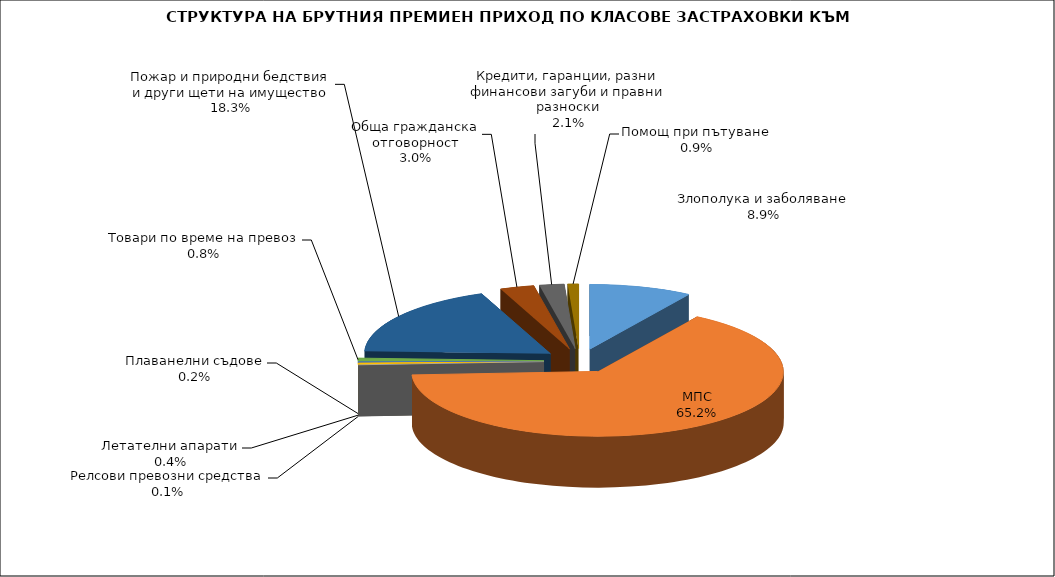
| Category | Злополука и заболяване |
|---|---|
| Злополука и заболяване | 0.089 |
| МПС | 0.652 |
| Релсови превозни средства | 0.001 |
| Летателни апарати | 0.004 |
| Плаванелни съдове | 0.002 |
| Товари по време на превоз | 0.008 |
| Пожар и природни бедствия и други щети на имущество | 0.183 |
| Обща гражданска отговорност | 0.03 |
| Кредити, гаранции, разни финансови загуби и правни разноски | 0.021 |
| Помощ при пътуване | 0.009 |